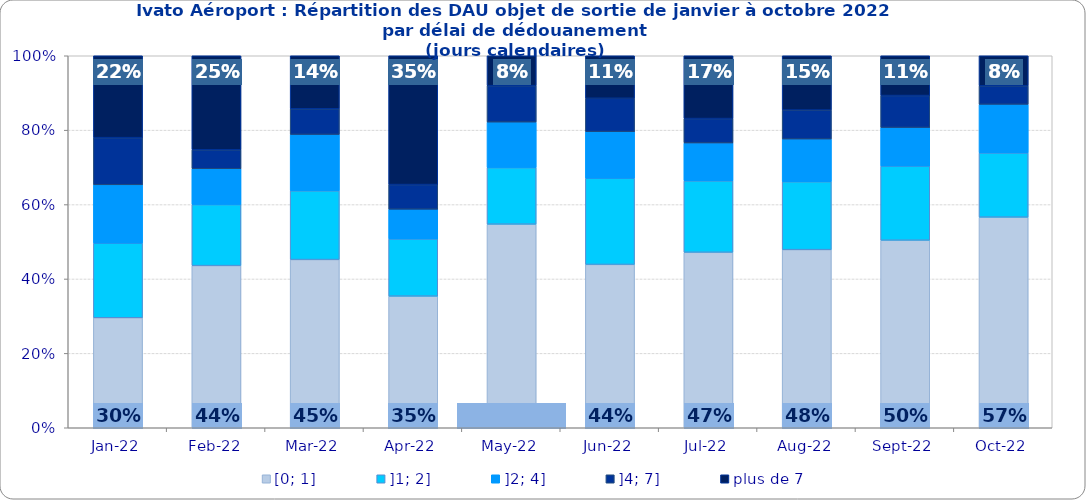
| Category | [0; 1] | ]1; 2] | ]2; 4] | ]4; 7] | plus de 7 |
|---|---|---|---|---|---|
| 2022-01-01 | 0.296 | 0.201 | 0.157 | 0.127 | 0.22 |
| 2022-02-01 | 0.436 | 0.164 | 0.096 | 0.051 | 0.253 |
| 2022-03-01 | 0.452 | 0.185 | 0.151 | 0.069 | 0.143 |
| 2022-04-01 | 0.354 | 0.154 | 0.08 | 0.066 | 0.346 |
| 2022-05-01 | 0.547 | 0.152 | 0.122 | 0.098 | 0.08 |
| 2022-06-01 | 0.439 | 0.232 | 0.125 | 0.09 | 0.114 |
| 2022-07-01 | 0.472 | 0.192 | 0.102 | 0.066 | 0.169 |
| 2022-08-01 | 0.479 | 0.183 | 0.115 | 0.078 | 0.146 |
| 2022-09-01 | 0.504 | 0.199 | 0.104 | 0.086 | 0.107 |
| 2022-10-01 | 0.566 | 0.173 | 0.131 | 0.05 | 0.081 |